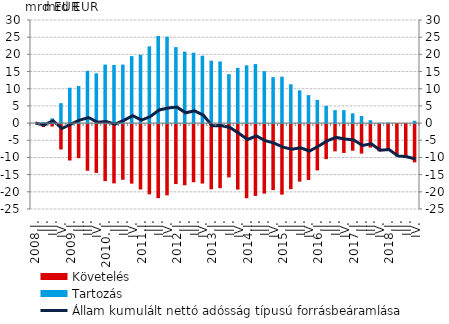
| Category | Követelés | Tartozás |
|---|---|---|
| 2008.I. | 0 | 0 |
| II. | -0.851 | 0.337 |
| III. | -0.698 | 1.39 |
| IV. | -7.383 | 5.802 |
| 2009.I. | -10.588 | 10.291 |
| II. | -9.918 | 10.776 |
| III. | -13.585 | 15.207 |
| IV. | -14.207 | 14.485 |
| 2010. I. | -16.589 | 17.029 |
| II. | -17.255 | 16.921 |
| III. | -16.201 | 17.019 |
| IV. | -17.327 | 19.493 |
| 2011.I. | -19.023 | 19.892 |
| II. | -20.434 | 22.342 |
| III. | -21.552 | 25.368 |
| IV. | -20.744 | 25.148 |
| 2012.I. | -17.452 | 22.1 |
| II. | -17.803 | 20.791 |
| III. | -16.919 | 20.478 |
| IV. | -17.305 | 19.594 |
| 2013.I. | -18.967 | 18.165 |
| II. | -18.657 | 17.945 |
| III. | -15.517 | 14.234 |
| IV. | -19.044 | 16.078 |
| 2014.I. | -21.576 | 16.806 |
| II. | -20.902 | 17.179 |
| III. | -20.231 | 15.101 |
| IV. | -19.214 | 13.372 |
| 2015.I. | -20.524 | 13.517 |
| II. | -18.928 | 11.298 |
| III. | -16.746 | 9.531 |
| IV. | -16.249 | 8.129 |
| 2016.I. | -13.479 | 6.745 |
| II. | -10.189 | 5.006 |
| III. | -7.934 | 3.767 |
| IV. | -8.398 | 3.778 |
| 2017.I. | -7.739 | 2.842 |
| II. | -8.585 | 2.058 |
| III. | -6.851 | 0.837 |
| IV. | -7.951 | 0.066 |
| 2018.I. | -7.79 | 0.126 |
| II. | -9.071 | -0.46 |
| III. | -9.343 | -0.467 |
| IV. | -11.145 | 0.681 |